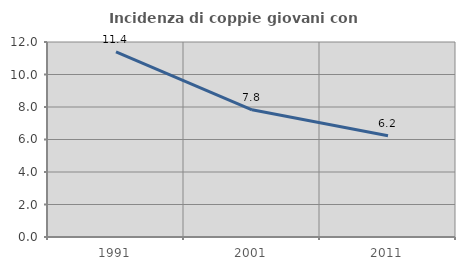
| Category | Incidenza di coppie giovani con figli |
|---|---|
| 1991.0 | 11.393 |
| 2001.0 | 7.825 |
| 2011.0 | 6.227 |